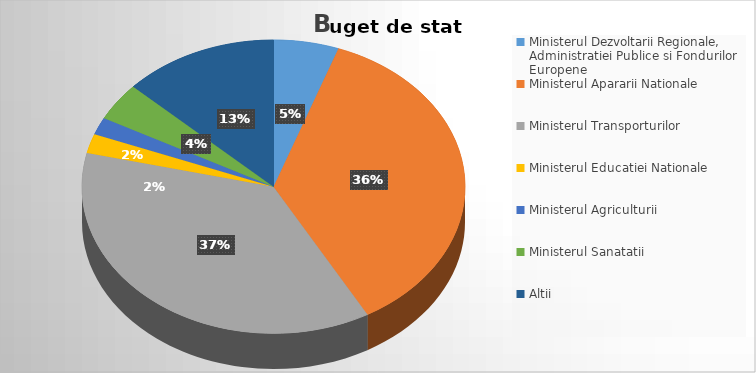
| Category | Series 0 |
|---|---|
| Ministerul Dezvoltarii Regionale, Administratiei Publice si Fondurilor Europene | 5.494 |
| Ministerul Apararii Nationale | 36.348 |
| Ministerul Transporturilor | 36.832 |
| Ministerul Educatiei Nationale | 2.143 |
| Ministerul Agriculturii | 1.896 |
| Ministerul Sanatatii | 4.203 |
| Altii | 13.083 |